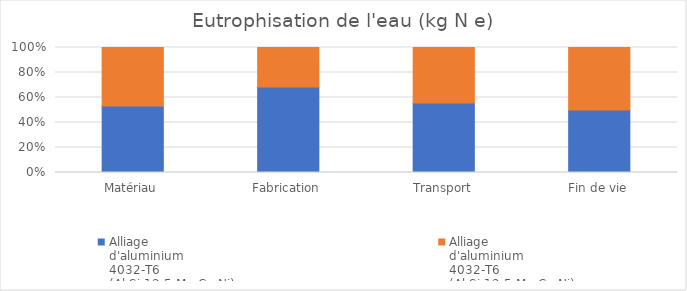
| Category | Alliage
d'aluminium
4032-T6
(Al Si 12,5 Mg Cu Ni)
Biellette initiale | Alliage
d'aluminium
4032-T6
(Al Si 12,5 Mg Cu Ni)
Biellette modifiée |
|---|---|---|
| Matériau | 0 | 0 |
| Fabrication | 0 | 0 |
| Transport | 0 | 0 |
| Fin de vie | 0 | 0 |